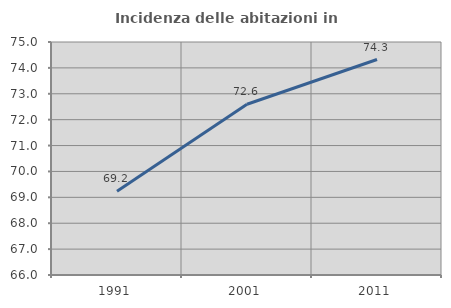
| Category | Incidenza delle abitazioni in proprietà  |
|---|---|
| 1991.0 | 69.231 |
| 2001.0 | 72.597 |
| 2011.0 | 74.323 |